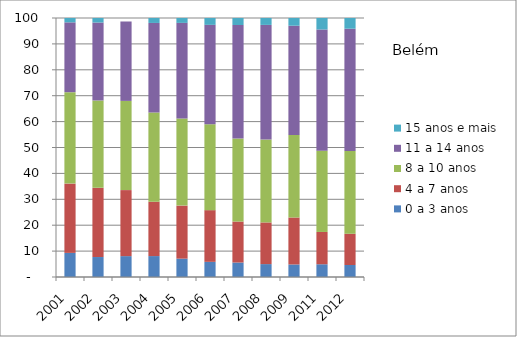
| Category | 0 a 3 anos | 4 a 7 anos | 8 a 10 anos | 11 a 14 anos | 15 anos e mais |
|---|---|---|---|---|---|
| 2001.0 | 9.31 | 26.75 | 35.3 | 26.96 | 1.68 |
| 2002.0 | 7.71 | 26.72 | 33.73 | 30.09 | 1.74 |
| 2003.0 | 8.06 | 25.49 | 34.44 | 30.66 | 0 |
| 2004.0 | 8.08 | 20.98 | 34.42 | 34.61 | 1.9 |
| 2005.0 | 7.09 | 20.47 | 33.68 | 36.88 | 1.87 |
| 2006.0 | 5.85 | 19.97 | 33.12 | 38.42 | 2.65 |
| 2007.0 | 5.59 | 15.82 | 32.04 | 43.85 | 2.7 |
| 2008.0 | 4.98 | 16.09 | 32 | 44.26 | 2.67 |
| 2009.0 | 4.84 | 18.13 | 31.88 | 42.17 | 2.97 |
| 2011.0 | 4.92 | 12.47 | 31.39 | 46.78 | 4.44 |
| 2012.0 | 4.63 | 12.06 | 31.98 | 47.19 | 4.14 |